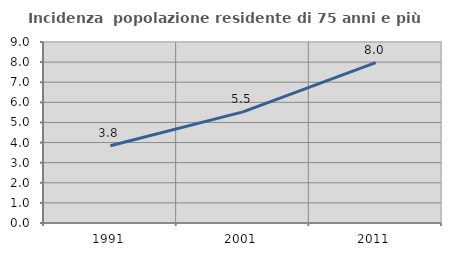
| Category | Incidenza  popolazione residente di 75 anni e più |
|---|---|
| 1991.0 | 3.841 |
| 2001.0 | 5.526 |
| 2011.0 | 7.972 |